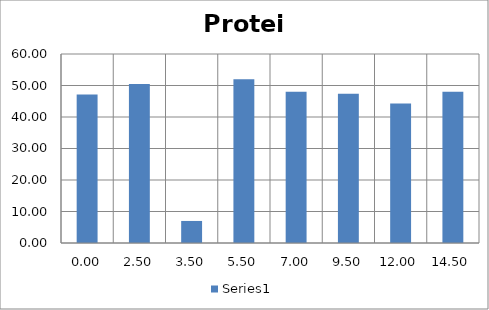
| Category | Series 0 |
|---|---|
| 0.0 | 47.104 |
| 2.5 | 50.46 |
| 3.5 | 7 |
| 5.5 | 52 |
| 7.0 | 47.98 |
| 9.5 | 47.36 |
| 12.0 | 44.3 |
| 14.5 | 48 |